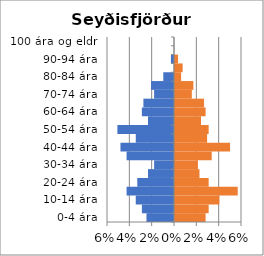
| Category | % karlar | %konur |
|---|---|---|
| 0-4 ára | -0.025 | 0.027 |
| 5-9 ára | -0.029 | 0.03 |
| 10-14 ára | -0.034 | 0.04 |
| 15-19 ára | -0.042 | 0.056 |
| 20-24 ára | -0.033 | 0.03 |
| 25-29 ára | -0.023 | 0.022 |
| 30-34 ára | -0.018 | 0.021 |
| 35-39 ára | -0.042 | 0.033 |
| 40-44 ára | -0.048 | 0.049 |
| 45-49 ára | -0.034 | 0.029 |
| 50-54 ára | -0.051 | 0.03 |
| 55-59 ára | -0.023 | 0.023 |
| 60-64 ára | -0.029 | 0.027 |
| 65-69 ára | -0.027 | 0.026 |
| 70-74 ára | -0.018 | 0.015 |
| 75-79 ára | -0.021 | 0.016 |
| 80-84 ára | -0.01 | 0.005 |
| 85-89 ára | 0 | 0.007 |
| 90-94 ára | -0.003 | 0.003 |
| 95-99 ára | 0 | 0 |
| 100 ára og eldri | 0 | 0 |